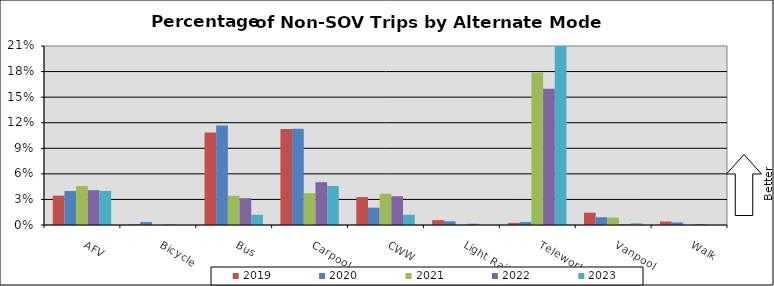
| Category | 2019 | 2020 | 2021 | 2022 | 2023 |
|---|---|---|---|---|---|
| AFV | 0.034 | 0.04 | 0.046 | 0.041 | 0.04 |
| Bicycle | 0.001 | 0.003 | 0 | 0 | 0 |
| Bus | 0.108 | 0.117 | 0.034 | 0.032 | 0.012 |
| Carpool | 0.113 | 0.113 | 0.037 | 0.05 | 0.046 |
| CWW | 0.033 | 0.02 | 0.037 | 0.034 | 0.012 |
| Light Rail | 0.006 | 0.004 | 0 | 0.001 | 0 |
| Telework | 0.002 | 0.003 | 0.179 | 0.16 | 0.225 |
| Vanpool | 0.014 | 0.009 | 0.009 | 0.001 | 0.002 |
| Walk | 0.004 | 0.003 | 0 | 0.001 | 0 |